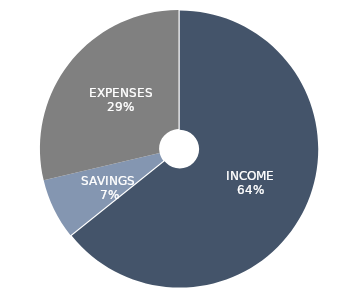
| Category | Series 0 |
|---|---|
| INCOME | 92480 |
| SAVINGS  | 10200 |
| EXPENSES | 41287 |